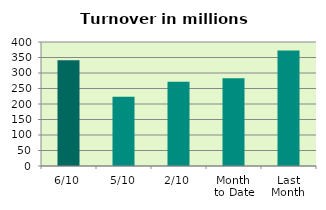
| Category | Series 0 |
|---|---|
| 6/10 | 340.869 |
| 5/10 | 223.044 |
| 2/10 | 272.05 |
| Month 
to Date | 283.321 |
| Last
Month | 372.713 |